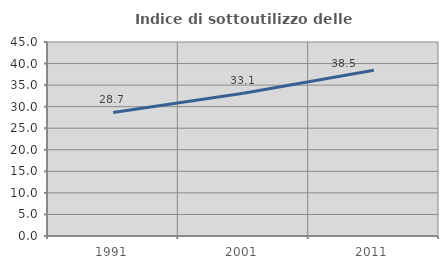
| Category | Indice di sottoutilizzo delle abitazioni  |
|---|---|
| 1991.0 | 28.659 |
| 2001.0 | 33.113 |
| 2011.0 | 38.462 |